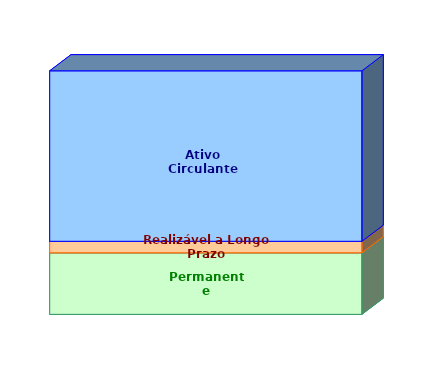
| Category | Permanente | Realizável a Longo Prazo | Ativo Circulante |
|---|---|---|---|
| 0 | 0.253 | 0.047 | 0.7 |